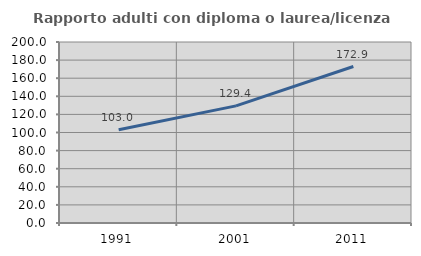
| Category | Rapporto adulti con diploma o laurea/licenza media  |
|---|---|
| 1991.0 | 102.963 |
| 2001.0 | 129.444 |
| 2011.0 | 172.928 |